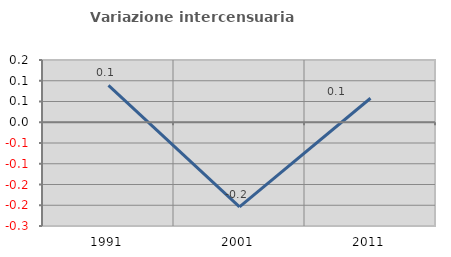
| Category | Variazione intercensuaria annua |
|---|---|
| 1991.0 | 0.089 |
| 2001.0 | -0.204 |
| 2011.0 | 0.058 |